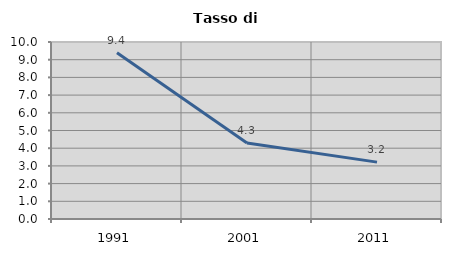
| Category | Tasso di disoccupazione   |
|---|---|
| 1991.0 | 9.39 |
| 2001.0 | 4.291 |
| 2011.0 | 3.214 |